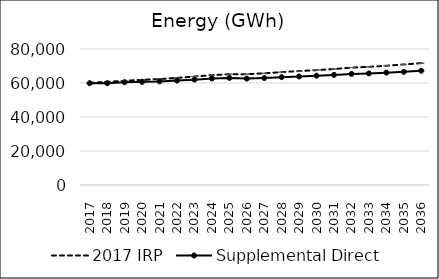
| Category | 2017 IRP | Supplemental Direct |
|---|---|---|
| 2017.0 | 60061.416 | 59901.75 |
| 2018.0 | 60670.449 | 59876.34 |
| 2019.0 | 61301.356 | 60448.53 |
| 2020.0 | 61863.305 | 60684.39 |
| 2021.0 | 62297.194 | 60952.64 |
| 2022.0 | 63007.033 | 61451.78 |
| 2023.0 | 63799.742 | 61983.04 |
| 2024.0 | 64610.372 | 62662 |
| 2025.0 | 65171.551 | 63004.77 |
| 2026.0 | 65182.973 | 62578.26 |
| 2027.0 | 65683.651 | 62922.46 |
| 2028.0 | 66405.196 | 63445.05 |
| 2029.0 | 67030.958 | 63845.88 |
| 2030.0 | 67587.834 | 64322.31 |
| 2031.0 | 68227.278 | 64770.98 |
| 2032.0 | 69064.299 | 65354.9 |
| 2033.0 | 69512.841 | 65647.92 |
| 2034.0 | 70162.329 | 66096.09 |
| 2035.0 | 70904.558 | 66564.41 |
| 2036.0 | 71697.055 | 67214.07 |